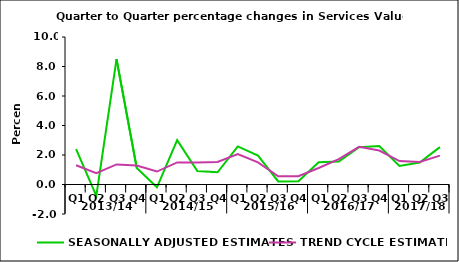
| Category | SEASONALLY ADJUSTED ESTIMATES | TREND CYCLE ESTIMATES |
|---|---|---|
| 0 | 2.401 | 1.308 |
| 1 | -0.769 | 0.774 |
| 2 | 8.5 | 1.363 |
| 3 | 1.123 | 1.283 |
| 4 | -0.19 | 0.878 |
| 5 | 3.007 | 1.497 |
| 6 | 0.914 | 1.494 |
| 7 | 0.826 | 1.525 |
| 8 | 2.584 | 2.064 |
| 9 | 1.957 | 1.502 |
| 10 | 0.204 | 0.562 |
| 11 | 0.218 | 0.565 |
| 12 | 1.508 | 1.116 |
| 13 | 1.556 | 1.721 |
| 14 | 2.522 | 2.556 |
| 15 | 2.613 | 2.305 |
| 16 | 1.26 | 1.585 |
| 17 | 1.494 | 1.521 |
| 18 | 2.534 | 1.96 |